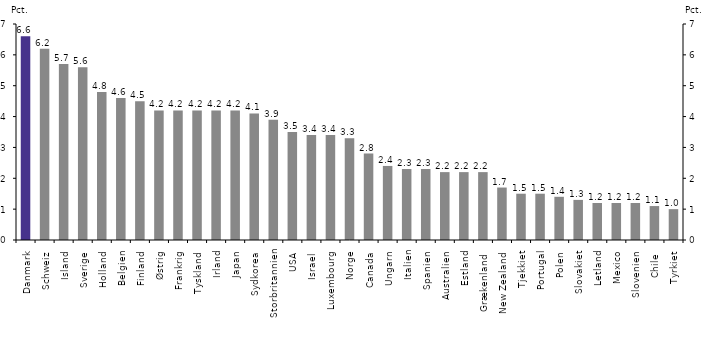
| Category | Academic-Corporate Collaboration (%) |
|---|---|
| Danmark | 6.6 |
| Schweiz | 6.2 |
| Island | 5.7 |
| Sverige | 5.6 |
| Holland | 4.8 |
| Belgien | 4.6 |
| Finland | 4.5 |
| Østrig | 4.2 |
| Frankrig | 4.2 |
| Tyskland | 4.2 |
| Irland | 4.2 |
| Japan | 4.2 |
| Sydkorea | 4.1 |
| Storbritannien | 3.9 |
| USA | 3.5 |
| Israel  | 3.4 |
| Luxembourg | 3.4 |
| Norge | 3.3 |
| Canada | 2.8 |
| Ungarn | 2.4 |
| Italien | 2.3 |
| Spanien | 2.3 |
| Australien | 2.2 |
| Estland | 2.2 |
| Grækenland  | 2.2 |
| New Zealand | 1.7 |
| Tjekkiet | 1.5 |
| Portugal | 1.5 |
| Polen | 1.4 |
| Slovakiet | 1.3 |
| Letland | 1.2 |
| Mexico | 1.2 |
| Slovenien | 1.2 |
| Chile  | 1.1 |
| Tyrkiet | 1 |